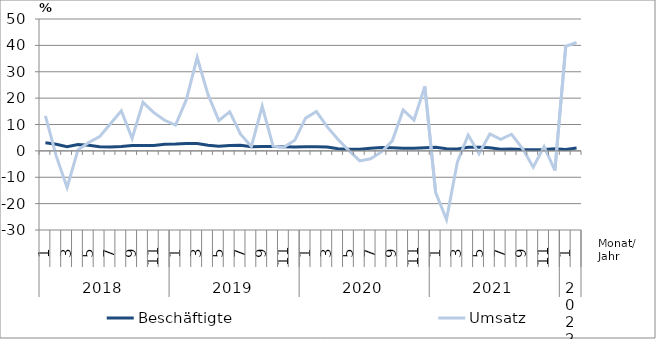
| Category | Beschäftigte | Umsatz |
|---|---|---|
| 0 | 3.1 | 13.3 |
| 1 | 2.5 | -2 |
| 2 | 1.6 | -13.9 |
| 3 | 2.4 | 0.4 |
| 4 | 2.1 | 3.2 |
| 5 | 1.6 | 5.4 |
| 6 | 1.5 | 10.3 |
| 7 | 1.7 | 15.2 |
| 8 | 2 | 4.7 |
| 9 | 2 | 18.4 |
| 10 | 2 | 14.5 |
| 11 | 2.5 | 11.6 |
| 12 | 2.6 | 9.8 |
| 13 | 2.8 | 19.4 |
| 14 | 2.8 | 35.4 |
| 15 | 2.1 | 21.3 |
| 16 | 1.8 | 11.5 |
| 17 | 2 | 14.8 |
| 18 | 2.1 | 6.3 |
| 19 | 1.6 | 1.7 |
| 20 | 1.7 | 16.9 |
| 21 | 1.7 | 1.8 |
| 22 | 1.6 | 1.4 |
| 23 | 1.5 | 4 |
| 24 | 1.6 | 12.4 |
| 25 | 1.6 | 14.9 |
| 26 | 1.5 | 9.1 |
| 27 | 0.8 | 4.3 |
| 28 | 0.6 | 0.1 |
| 29 | 0.6 | -3.8 |
| 30 | 1 | -3 |
| 31 | 1.3 | -0.4 |
| 32 | 1.2 | 3.8 |
| 33 | 1 | 15.5 |
| 34 | 1 | 11.7 |
| 35 | 1.2 | 24.4 |
| 36 | 1.4 | -15.8 |
| 37 | 0.8 | -26 |
| 38 | 0.7 | -4.3 |
| 39 | 1.4 | 6 |
| 40 | 1.4 | -1.1 |
| 41 | 1.2 | 6.4 |
| 42 | 0.6 | 4.4 |
| 43 | 0.7 | 6.3 |
| 44 | 0.5 | 1 |
| 45 | 0.4 | -6.2 |
| 46 | 0.5 | 1.6 |
| 47 | 0.8 | -7.4 |
| 48 | 0.5 | 39.6 |
| 49 | 1.1 | 41.1 |